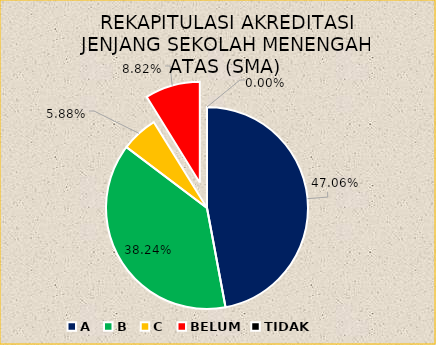
| Category | REKAPITULASI AKREDITASI JENJANG SEKOLAH MENENGAH ATAS (SMA) |
|---|---|
| A | 16 |
| B | 13 |
| C | 2 |
| BELUM | 3 |
| TIDAK | 0 |